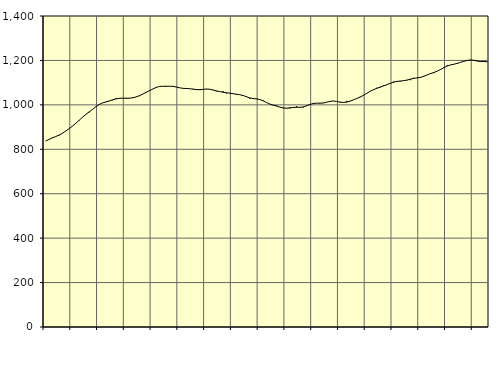
| Category | Piggar | Series 1 |
|---|---|---|
| nan | 837.2 | 837.03 |
| 87.0 | 844.1 | 844.34 |
| 87.0 | 853.3 | 851.46 |
| 87.0 | 857.9 | 857.43 |
| nan | 861.9 | 863.77 |
| 88.0 | 873.3 | 872.06 |
| 88.0 | 882.4 | 882.04 |
| 88.0 | 892.5 | 892.75 |
| nan | 903.9 | 904.34 |
| 89.0 | 916.7 | 916.91 |
| 89.0 | 929.1 | 930.48 |
| 89.0 | 943.9 | 944.34 |
| nan | 958.7 | 957.12 |
| 90.0 | 966.6 | 968.43 |
| 90.0 | 978.6 | 979.47 |
| 90.0 | 990.4 | 991.28 |
| nan | 1003.1 | 1001.68 |
| 91.0 | 1008.8 | 1008.76 |
| 91.0 | 1012.4 | 1013.27 |
| 91.0 | 1018.2 | 1017.52 |
| nan | 1020.9 | 1022.63 |
| 92.0 | 1030 | 1026.81 |
| 92.0 | 1027.6 | 1029.25 |
| 92.0 | 1031 | 1030.01 |
| nan | 1031.4 | 1029.8 |
| 93.0 | 1029.3 | 1030 |
| 93.0 | 1033.1 | 1031.62 |
| 93.0 | 1035.6 | 1035.51 |
| nan | 1039.4 | 1041.19 |
| 94.0 | 1047.6 | 1048.31 |
| 94.0 | 1057.3 | 1056.01 |
| 94.0 | 1062.6 | 1063.61 |
| nan | 1070.5 | 1071.22 |
| 95.0 | 1079.1 | 1078.28 |
| 95.0 | 1083.2 | 1082.67 |
| 95.0 | 1083.2 | 1083.63 |
| nan | 1085.1 | 1083.55 |
| 96.0 | 1083.4 | 1083.77 |
| 96.0 | 1084.2 | 1083.2 |
| 96.0 | 1080.7 | 1080.52 |
| nan | 1077.1 | 1076.98 |
| 97.0 | 1075.1 | 1074.45 |
| 97.0 | 1074.1 | 1073.63 |
| 97.0 | 1072.4 | 1072.83 |
| nan | 1072.2 | 1070.81 |
| 98.0 | 1066.6 | 1068.82 |
| 98.0 | 1070.2 | 1068.4 |
| 98.0 | 1070.2 | 1069.72 |
| nan | 1072 | 1071.07 |
| 99.0 | 1070 | 1070.34 |
| 99.0 | 1068.2 | 1067 |
| 99.0 | 1060.9 | 1062.84 |
| nan | 1058.3 | 1059.69 |
| 0.0 | 1061.8 | 1057.15 |
| 0.0 | 1051.2 | 1054.71 |
| 0.0 | 1054.1 | 1052.46 |
| nan | 1049.9 | 1050.35 |
| 1.0 | 1045.6 | 1048.03 |
| 1.0 | 1045.3 | 1045.64 |
| 1.0 | 1044.4 | 1042.15 |
| nan | 1038.1 | 1036.54 |
| 2.0 | 1027.2 | 1031.09 |
| 2.0 | 1030.1 | 1028.3 |
| 2.0 | 1025.9 | 1026.94 |
| nan | 1024.1 | 1023.96 |
| 3.0 | 1020.2 | 1018.31 |
| 3.0 | 1011.2 | 1010.81 |
| 3.0 | 1003.2 | 1003.78 |
| nan | 997.9 | 998.77 |
| 4.0 | 997.8 | 994.65 |
| 4.0 | 989.7 | 989.89 |
| 4.0 | 984.7 | 986.09 |
| nan | 984 | 985.1 |
| 5.0 | 983.9 | 986.59 |
| 5.0 | 986.8 | 988.45 |
| 5.0 | 993.2 | 988.95 |
| nan | 988 | 989.01 |
| 6.0 | 987.9 | 990.74 |
| 6.0 | 996.7 | 995.61 |
| 6.0 | 999.8 | 1001.92 |
| nan | 1008.3 | 1006.23 |
| 7.0 | 1007.3 | 1007.67 |
| 7.0 | 1006.7 | 1007.57 |
| 7.0 | 1007.7 | 1008.62 |
| nan | 1012.4 | 1011.95 |
| 8.0 | 1016.4 | 1015.82 |
| 8.0 | 1017.9 | 1017.26 |
| 8.0 | 1015 | 1015.27 |
| nan | 1010.2 | 1012.26 |
| 9.0 | 1011.4 | 1010.84 |
| 9.0 | 1017.8 | 1012.62 |
| 9.0 | 1016 | 1016.93 |
| nan | 1023.2 | 1022.62 |
| 10.0 | 1028.8 | 1028.62 |
| 10.0 | 1036.2 | 1035.05 |
| 10.0 | 1041.8 | 1043.05 |
| nan | 1053.3 | 1052.3 |
| 11.0 | 1060.8 | 1061.14 |
| 11.0 | 1066.8 | 1068.51 |
| 11.0 | 1077.2 | 1074.57 |
| nan | 1078 | 1080.22 |
| 12.0 | 1087.9 | 1085.42 |
| 12.0 | 1091.1 | 1090.8 |
| 12.0 | 1095.9 | 1096.85 |
| nan | 1104.8 | 1102.01 |
| 13.0 | 1105.4 | 1105.42 |
| 13.0 | 1105 | 1107.32 |
| 13.0 | 1108.5 | 1109.01 |
| nan | 1110.5 | 1111.63 |
| 14.0 | 1111 | 1115.52 |
| 14.0 | 1122 | 1119.23 |
| 14.0 | 1121.5 | 1121.42 |
| nan | 1122.1 | 1123.64 |
| 15.0 | 1130.4 | 1128.29 |
| 15.0 | 1135.2 | 1134.91 |
| 15.0 | 1142.4 | 1140.55 |
| nan | 1143 | 1145.7 |
| 16.0 | 1151.2 | 1151.57 |
| 16.0 | 1161.1 | 1159.04 |
| 16.0 | 1166.1 | 1167.37 |
| nan | 1177.6 | 1174.78 |
| 17.0 | 1179.7 | 1179.81 |
| 17.0 | 1182 | 1182.93 |
| 17.0 | 1184.4 | 1186.62 |
| nan | 1191.3 | 1191.27 |
| 18.0 | 1195.3 | 1196.16 |
| 18.0 | 1198.5 | 1200.05 |
| 18.0 | 1203.1 | 1201.73 |
| nan | 1202.1 | 1200.4 |
| 19.0 | 1198.8 | 1197.05 |
| 19.0 | 1193.4 | 1194.95 |
| 19.0 | 1197 | 1195.11 |
| nan | 1192.9 | 1194.05 |